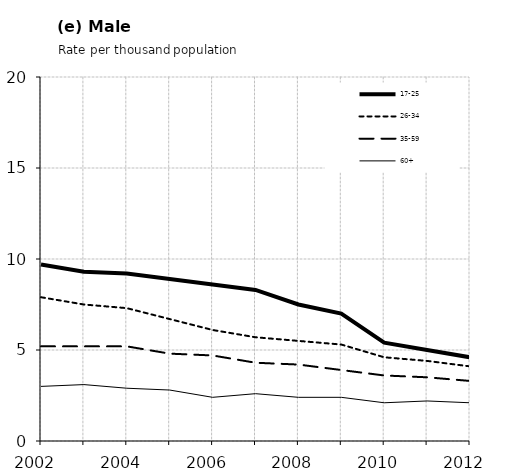
| Category | 17-25 | 26-34 | 35-59 | 60+ |
|---|---|---|---|---|
| 2002.0 | 9.7 | 7.9 | 5.2 | 3 |
| 2003.0 | 9.3 | 7.5 | 5.2 | 3.1 |
| 2004.0 | 9.2 | 7.3 | 5.2 | 2.9 |
| 2005.0 | 8.9 | 6.7 | 4.8 | 2.8 |
| 2006.0 | 8.6 | 6.1 | 4.7 | 2.4 |
| 2007.0 | 8.3 | 5.7 | 4.3 | 2.6 |
| 2008.0 | 7.5 | 5.5 | 4.2 | 2.4 |
| 2009.0 | 7 | 5.3 | 3.9 | 2.4 |
| 2010.0 | 5.4 | 4.6 | 3.6 | 2.1 |
| 2011.0 | 5 | 4.4 | 3.5 | 2.2 |
| 2012.0 | 4.6 | 4.1 | 3.3 | 2.1 |